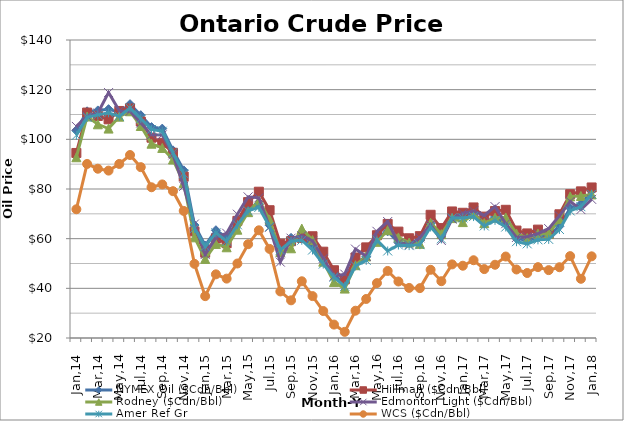
| Category | NYMEX Oil ($Cdn/Bbl) | Hillman ($Cdn/Bbl) | Rodney ($Cdn/Bbl) | Edmonton Light ($Cdn/Bbl) | Amer Ref Gr | WCS ($Cdn/Bbl) |
|---|---|---|---|---|---|---|
| Jan,14 | 103.689 | 94.51 | 92.79 | 105.194 | 101.626 | 71.837 |
| Feb,14 | 111.276 | 110.78 | 109.19 | 109.367 | 108.827 | 90.091 |
| Mar,14 | 111.644 | 109.41 | 106.06 | 110.58 | 109.846 | 88.165 |
| Apr,14 | 112.148 | 108.05 | 104.33 | 118.836 | 110.703 | 87.405 |
| May,14 | 110.852 | 111.428 | 109.129 | 111.489 | 109.268 | 90.081 |
| Jun,14 | 114.161 | 112.423 | 111.304 | 111.308 | 112.591 | 93.689 |
| Jul,14 | 109.729 | 107.18 | 105.369 | 106.561 | 108.358 | 88.8 |
| Aug,14 | 104.943 | 100.657 | 98.242 | 101.861 | 103.997 | 80.701 |
| Sep,14 | 104.323 | 98.601 | 96.537 | 101.786 | 103.264 | 81.839 |
| Oct,14 | 95.565 | 94.588 | 91.866 | 93.765 | 94.58 | 79.121 |
| Nov,14 | 87.51 | 84.999 | 82.436 | 81.091 | 86.171 | 71.176 |
| Dec,14 | 65.483 | 62.924 | 60.543 | 65.915 | 64.092 | 49.861 |
| Jan,15 | 57.25 | 54.357 | 51.845 | 53.64 | 56.827 | 36.846 |
| Feb,15 | 63.404 | 60.052 | 57.876 | 60.39 | 62.329 | 45.636 |
| Mar,15 | 60.345 | 58.155 | 56.532 | 62.2 | 58.97 | 43.91 |
| Apr,15 | 67.162 | 67.162 | 63.617 | 69.85 | 65.581 | 49.999 |
| May,15 | 72.305 | 74.732 | 70.676 | 76.83 | 71.209 | 57.768 |
| Jun,15 | 73.919 | 78.907 | 75.411 | 76.44 | 72.597 | 63.369 |
| Jul,15 | 65.429 | 71.455 | 67.666 | 64.58 | 64.8 | 55.873 |
| Aug,15 | 56.375 | 57.995 | 54.645 | 50.57 | 55.455 | 38.746 |
| Sep,15 | 60.341 | 58.989 | 56.133 | 60.192 | 58.971 | 35.17 |
| Oct,15 | 60.502 | 60.314 | 64.057 | 61.177 | 59.367 | 42.845 |
| Nov,15 | 56.981 | 60.973 | 59.446 | 59.066 | 55.419 | 36.878 |
| Dec,15 | 51.186 | 54.753 | 50.75 | 52.024 | 49.769 | 30.865 |
| Jan,16 | 45.146 | 47.285 | 42.519 | 44.914 | 44.461 | 25.403 |
| Feb,16 | 42.219 | 43.589 | 39.895 | 45.722 | 40.815 | 22.477 |
| Mar,16 | 50.142 | 52.422 | 49.314 | 55.803 | 49.009 | 30.988 |
| Apr,16 | 52.688 | 56.489 | 52.845 | 52.914 | 51.285 | 35.719 |
| May,16 | 60.593 | 61.383 | 58.721 | 62.96 | 59.428 | 42.104 |
| Jun,16 | 62.957 | 65.933 | 63.412 | 66.89 | 55.044 | 46.999 |
| Jul,16 | 58.402 | 62.836 | 60.504 | 58.2 | 57.457 | 42.76 |
| Aug,16 | 58.235 | 60.159 | 58.426 | 57.54 | 57.205 | 40.17 |
| Sep,16 | 59.2 | 61.012 | 57.906 | 60.34 | 57.582 | 40.081 |
| Oct,16 | 66.149 | 69.615 | 66.401 | 65.655 | 64.675 | 47.459 |
| Nov,16 | 61.53 | 64.262 | 61.841 | 59.252 | 59.938 | 42.876 |
| Dec,16 | 69.652 | 70.956 | 68.278 | 67.883 | 68.376 | 49.643 |
| Jan,17 | 69.463 | 70.426 | 66.674 | 70.263 | 68.355 | 49.105 |
| Feb,17 | 70.095 | 72.571 | 69.871 | 71.136 | 68.898 | 51.317 |
| Mar,17 | 66.475 | 68.879 | 66.254 | 69.358 | 65.124 | 47.748 |
| Apr,17 | 68.678 | 71.118 | 68.452 | 72.914 | 67.369 | 49.496 |
| May,17 | 65.993 | 71.625 | 68.537 | 66.034 | 64.689 | 52.805 |
| Jun,17 | 60.076 | 63.267 | 62.036 | 60.492 | 58.788 | 47.587 |
| Jul,17 | 59.257 | 62.109 | 60.273 | 60.781 | 57.919 | 46.174 |
| Aug,17 | 60.587 | 63.642 | 62.025 | 61.992 | 59.531 | 48.537 |
| Sep,17 | 61.304 | 61.944 | 62.001 | 64.05 | 59.71 | 47.33 |
| Oct,17 | 64.973 | 69.814 | 67.871 | 69.218 | 63.712 | 48.5 |
| Nov,17 | 72.302 | 77.915 | 77.01 | 74.995 | 71.177 | 52.97 |
| Dec,17 | 73.943 | 79.047 | 77.194 | 71.704 | 72.869 | 43.84 |
| Jan,18 | 79.159 | 80.619 | 77.818 | 75.84 | 77.86 | 52.89 |